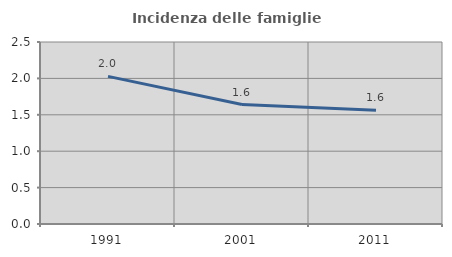
| Category | Incidenza delle famiglie numerose |
|---|---|
| 1991.0 | 2.027 |
| 2001.0 | 1.641 |
| 2011.0 | 1.563 |